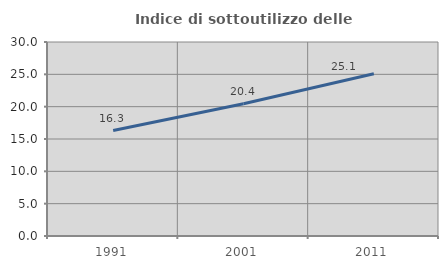
| Category | Indice di sottoutilizzo delle abitazioni  |
|---|---|
| 1991.0 | 16.303 |
| 2001.0 | 20.446 |
| 2011.0 | 25.087 |